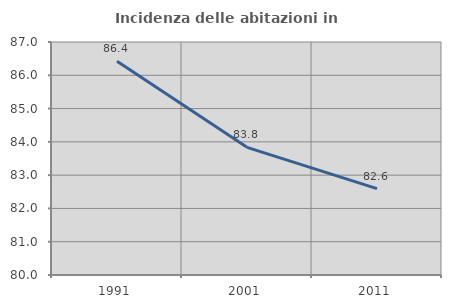
| Category | Incidenza delle abitazioni in proprietà  |
|---|---|
| 1991.0 | 86.421 |
| 2001.0 | 83.835 |
| 2011.0 | 82.594 |